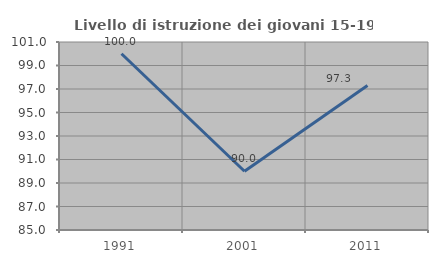
| Category | Livello di istruzione dei giovani 15-19 anni |
|---|---|
| 1991.0 | 100 |
| 2001.0 | 90 |
| 2011.0 | 97.297 |